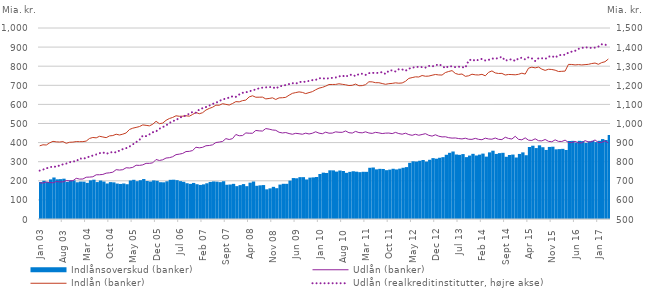
| Category | Indlånsoverskud (banker) |
|---|---|
| 2003-01-01 | 193.522 |
| 2003-02-01 | 200.185 |
| 2003-03-01 | 193.537 |
| 2003-04-01 | 207.404 |
| 2003-05-01 | 217.318 |
| 2003-06-01 | 207.733 |
| 2003-07-01 | 208.648 |
| 2003-08-01 | 211.058 |
| 2003-09-01 | 194.703 |
| 2003-10-01 | 201.962 |
| 2003-11-01 | 202.167 |
| 2003-12-01 | 192.203 |
| 2004-01-01 | 195.922 |
| 2004-02-01 | 195.548 |
| 2004-03-01 | 189.282 |
| 2004-04-01 | 202.383 |
| 2004-05-01 | 205.703 |
| 2004-06-01 | 193.349 |
| 2004-07-01 | 201.412 |
| 2004-08-01 | 196.215 |
| 2004-09-01 | 185.887 |
| 2004-10-01 | 193.144 |
| 2004-11-01 | 191.806 |
| 2004-12-01 | 185.584 |
| 2005-01-01 | 183.528 |
| 2005-02-01 | 185.957 |
| 2005-03-01 | 182.112 |
| 2005-04-01 | 201.515 |
| 2005-05-01 | 205.198 |
| 2005-06-01 | 198.127 |
| 2005-07-01 | 203.156 |
| 2005-08-01 | 209.157 |
| 2005-09-01 | 199.049 |
| 2005-10-01 | 196.265 |
| 2005-11-01 | 202.21 |
| 2005-12-01 | 200.009 |
| 2006-01-01 | 192.682 |
| 2006-02-01 | 192.091 |
| 2006-03-01 | 197.434 |
| 2006-04-01 | 205.078 |
| 2006-05-01 | 205.744 |
| 2006-06-01 | 203.338 |
| 2006-07-01 | 198.241 |
| 2006-08-01 | 194.931 |
| 2006-09-01 | 187.363 |
| 2006-10-01 | 184.031 |
| 2006-11-01 | 188.827 |
| 2006-12-01 | 182.165 |
| 2007-01-01 | 178.521 |
| 2007-02-01 | 181.32 |
| 2007-03-01 | 187 |
| 2007-04-01 | 193.974 |
| 2007-05-01 | 196.727 |
| 2007-06-01 | 195.517 |
| 2007-07-01 | 192.986 |
| 2007-08-01 | 197.691 |
| 2007-09-01 | 179.359 |
| 2007-10-01 | 180.608 |
| 2007-11-01 | 184.026 |
| 2007-12-01 | 172.065 |
| 2008-01-01 | 177.423 |
| 2008-02-01 | 182.789 |
| 2008-03-01 | 171.936 |
| 2008-04-01 | 190.22 |
| 2008-05-01 | 196.241 |
| 2008-06-01 | 173.895 |
| 2008-07-01 | 176.27 |
| 2008-08-01 | 177.607 |
| 2008-09-01 | 155.391 |
| 2008-10-01 | 160.475 |
| 2008-11-01 | 168.377 |
| 2008-12-01 | 161.339 |
| 2009-01-01 | 180.186 |
| 2009-02-01 | 184.345 |
| 2009-03-01 | 184.248 |
| 2009-04-01 | 200.984 |
| 2009-05-01 | 214.312 |
| 2009-06-01 | 213.153 |
| 2009-07-01 | 219.094 |
| 2009-08-01 | 219.065 |
| 2009-09-01 | 207.019 |
| 2009-10-01 | 216.646 |
| 2009-11-01 | 217.845 |
| 2009-12-01 | 219.914 |
| 2010-01-01 | 235.578 |
| 2010-02-01 | 242.64 |
| 2010-03-01 | 241.038 |
| 2010-04-01 | 254.853 |
| 2010-05-01 | 254.6 |
| 2010-06-01 | 248.3 |
| 2010-07-01 | 253.821 |
| 2010-08-01 | 251.408 |
| 2010-09-01 | 241.765 |
| 2010-10-01 | 246.825 |
| 2010-11-01 | 249.989 |
| 2010-12-01 | 247.804 |
| 2011-01-01 | 245.258 |
| 2011-02-01 | 247.199 |
| 2011-03-01 | 247 |
| 2011-04-01 | 268.12 |
| 2011-05-01 | 269.603 |
| 2011-06-01 | 259.967 |
| 2011-07-01 | 262.604 |
| 2011-08-01 | 261.949 |
| 2011-09-01 | 255.639 |
| 2011-10-01 | 258.506 |
| 2011-11-01 | 262.976 |
| 2011-12-01 | 259.555 |
| 2012-01-01 | 263.573 |
| 2012-02-01 | 268.288 |
| 2012-03-01 | 271.715 |
| 2012-04-01 | 294.107 |
| 2012-05-01 | 302.109 |
| 2012-06-01 | 300.735 |
| 2012-07-01 | 304.959 |
| 2012-08-01 | 308.807 |
| 2012-09-01 | 300.581 |
| 2012-10-01 | 310.081 |
| 2012-11-01 | 318.712 |
| 2012-12-01 | 315.736 |
| 2013-01-01 | 320.601 |
| 2013-02-01 | 323.803 |
| 2013-03-01 | 336.193 |
| 2013-04-01 | 346.533 |
| 2013-05-01 | 353.418 |
| 2013-06-01 | 337.683 |
| 2013-07-01 | 335.901 |
| 2013-08-01 | 339.882 |
| 2013-09-01 | 323.954 |
| 2013-10-01 | 332.143 |
| 2013-11-01 | 341.176 |
| 2013-12-01 | 332.513 |
| 2014-01-01 | 337.009 |
| 2014-02-01 | 342.437 |
| 2014-03-01 | 326.53 |
| 2014-04-01 | 348.922 |
| 2014-05-01 | 357.48 |
| 2014-06-01 | 340.75 |
| 2014-07-01 | 344.811 |
| 2014-08-01 | 346.528 |
| 2014-09-01 | 325.71 |
| 2014-10-01 | 335.077 |
| 2014-11-01 | 337.322 |
| 2014-12-01 | 321.993 |
| 2015-01-01 | 340.583 |
| 2015-02-01 | 348.866 |
| 2015-03-01 | 333.941 |
| 2015-04-01 | 376.916 |
| 2015-05-01 | 383.732 |
| 2015-06-01 | 371.38 |
| 2015-07-01 | 385.657 |
| 2015-08-01 | 375.781 |
| 2015-09-01 | 361.595 |
| 2015-10-01 | 377.323 |
| 2015-11-01 | 378.514 |
| 2015-12-01 | 364.683 |
| 2016-01-01 | 365.925 |
| 2016-02-01 | 367.326 |
| 2016-03-01 | 361.26 |
| 2016-04-01 | 408.414 |
| 2016-05-01 | 409.067 |
| 2016-06-01 | 400.236 |
| 2016-07-01 | 409.298 |
| 2016-08-01 | 407.882 |
| 2016-09-01 | 397.85 |
| 2016-10-01 | 406.408 |
| 2016-11-01 | 409.503 |
| 2016-12-01 | 402.612 |
| 2017-01-01 | 409.434 |
| 2017-02-01 | 418.449 |
| 2017-03-01 | 413.691 |
| 2017-04-01 | 439.649 |